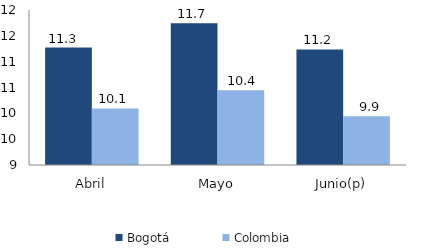
| Category | Bogotá | Colombia |
|---|---|---|
| Abril | 11.273 | 10.096 |
| Mayo | 11.744 | 10.447 |
| Junio(p) | 11.236 | 9.943 |